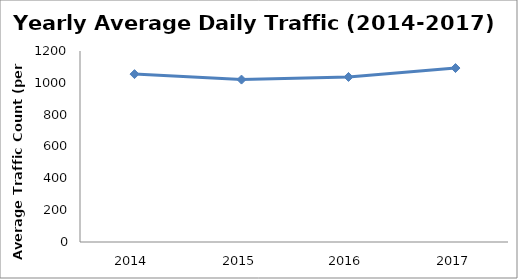
| Category | Series 0 |
|---|---|
| 2014.0 | 1054.797 |
| 2015.0 | 1020.367 |
| 2016.0 | 1036.915 |
| 2017.0 | 1092.926 |